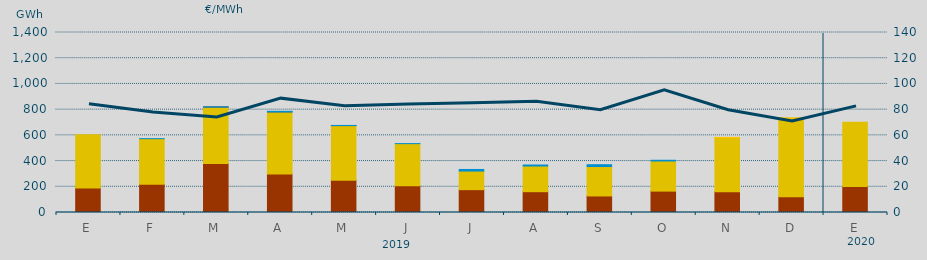
| Category | Carbón | Ciclo Combinado | Consumo Bombeo | Hidráulica | Otras Renovables |
|---|---|---|---|---|---|
| E | 190959 | 413339.8 | 0 | 0 | 0 |
| F | 219079.1 | 354875.6 | 0 | 360 | 0 |
| M | 380779.9 | 439376.7 | 792 | 709.4 | 0 |
| A | 299645.9 | 482984.6 | 52 | 4315.4 | 0 |
| M | 250250 | 425915 | 190 | 880 | 0 |
| J | 209003 | 326625.6 | 0 | 334.5 | 0 |
| J | 177655 | 144531.3 | 0 | 12515 | 0 |
| A | 161808 | 199805.1 | 0 | 7890 | 0 |
| S | 128712 | 228795.2 | 0 | 14281 | 0 |
| O | 166180 | 234526.2 | 0 | 5517.1 | 0 |
| N | 161365 | 421030.7 | 0 | 0 | 1775.2 |
| D | 122168 | 612250.1 | 0 | 0 | 164.2 |
| E | 202940 | 498564 | 0 | 0 | 0 |